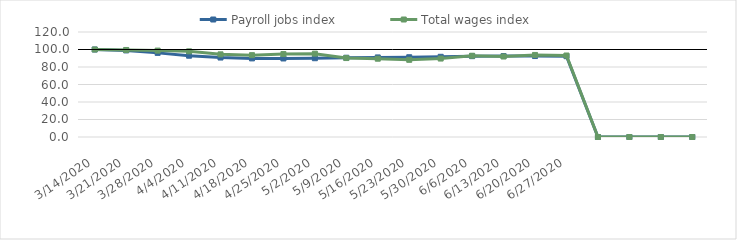
| Category | Payroll jobs index | Total wages index |
|---|---|---|
| 14/03/2020 | 100 | 100 |
| 21/03/2020 | 98.95 | 99.453 |
| 28/03/2020 | 96.141 | 98.754 |
| 04/04/2020 | 92.894 | 97.908 |
| 11/04/2020 | 90.807 | 94.459 |
| 18/04/2020 | 89.834 | 93.526 |
| 25/04/2020 | 89.752 | 94.777 |
| 02/05/2020 | 90.027 | 95.264 |
| 09/05/2020 | 90.598 | 90.228 |
| 16/05/2020 | 90.946 | 89.475 |
| 23/05/2020 | 91.155 | 88.211 |
| 30/05/2020 | 91.652 | 89.645 |
| 06/06/2020 | 92.4 | 92.867 |
| 13/06/2020 | 92.509 | 92.007 |
| 20/06/2020 | 92.52 | 93.769 |
| 27/06/2020 | 92.343 | 93.126 |